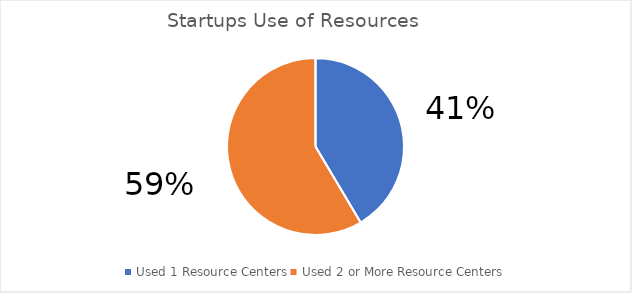
| Category | Series 0 |
|---|---|
| Used 1 Resource Centers | 17 |
| Used 2 or More Resource Centers | 24 |